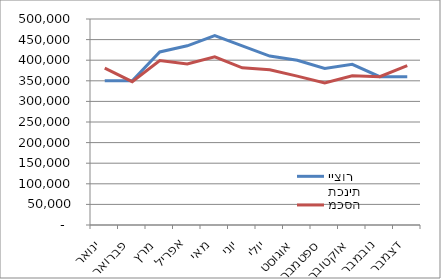
| Category | תכנית ייצור | מכסה |
|---|---|---|
| ינואר | 350000 | 380700 |
| פברואר | 350000 | 347850 |
| מרץ | 420000 | 399150 |
| אפריל | 435000 | 390600 |
| מאי | 460000 | 408150 |
| יוני | 435000 | 381600 |
| יולי | 410000 | 376650 |
| אוגוסט | 400000 | 361350 |
| ספטמבר | 380000 | 344700 |
| אוקטובר | 390000 | 362250 |
| נובמבר | 360000 | 360000 |
| דצמבר | 360000 | 387000 |